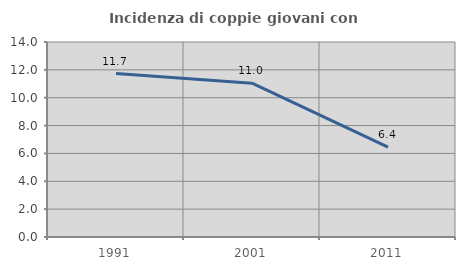
| Category | Incidenza di coppie giovani con figli |
|---|---|
| 1991.0 | 11.73 |
| 2001.0 | 11.042 |
| 2011.0 | 6.449 |